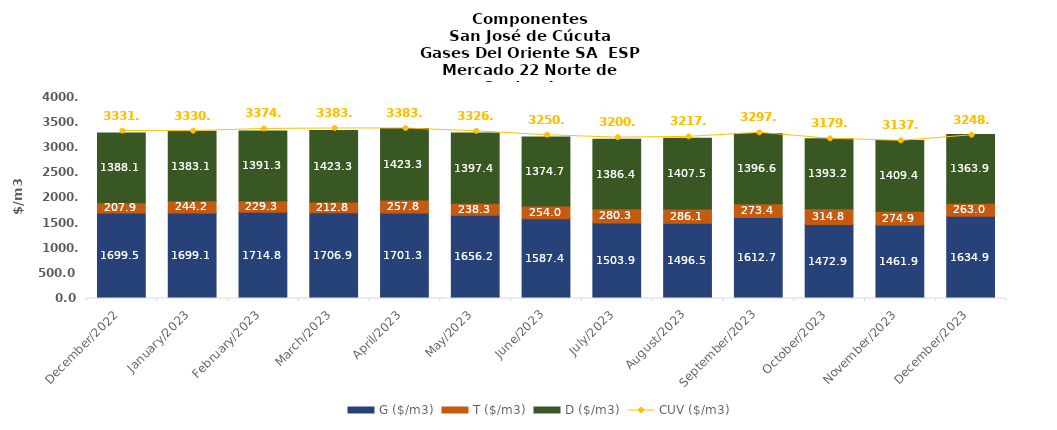
| Category | G ($/m3) | T ($/m3) | D ($/m3) |
|---|---|---|---|
| 2022-12-01 | 1699.54 | 207.91 | 1388.06 |
| 2023-01-01 | 1699.06 | 244.23 | 1383.12 |
| 2023-02-01 | 1714.78 | 229.32 | 1391.26 |
| 2023-03-01 | 1706.94 | 212.77 | 1423.33 |
| 2023-04-01 | 1701.33 | 257.81 | 1423.3 |
| 2023-05-01 | 1656.2 | 238.29 | 1397.37 |
| 2023-06-01 | 1587.41 | 254 | 1374.66 |
| 2023-07-01 | 1503.89 | 280.27 | 1386.35 |
| 2023-08-01 | 1496.47 | 286.1 | 1407.49 |
| 2023-09-01 | 1612.68 | 273.44 | 1396.57 |
| 2023-10-01 | 1472.87 | 314.83 | 1393.18 |
| 2023-11-01 | 1461.93 | 274.94 | 1409.38 |
| 2023-12-01 | 1634.91 | 262.98 | 1363.86 |